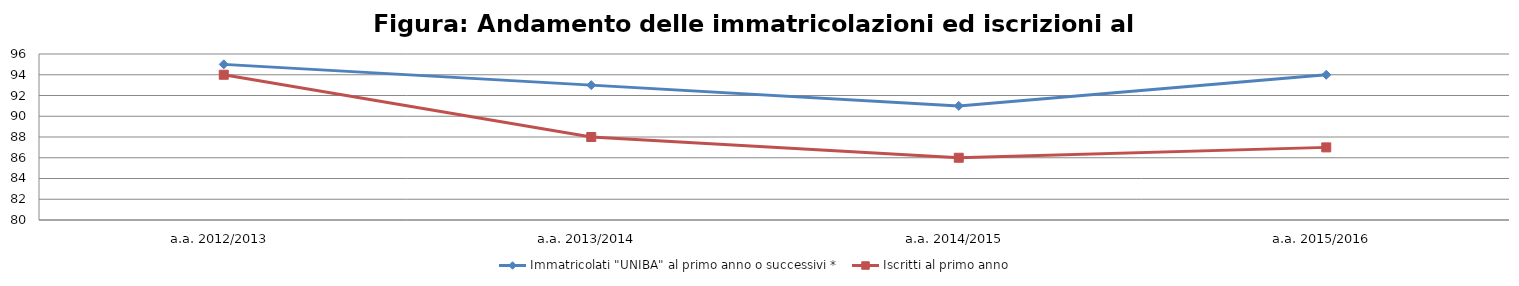
| Category | Immatricolati "UNIBA" al primo anno o successivi * | Iscritti al primo anno  |
|---|---|---|
| a.a. 2012/2013 | 95 | 94 |
| a.a. 2013/2014 | 93 | 88 |
| a.a. 2014/2015 | 91 | 86 |
| a.a. 2015/2016 | 94 | 87 |